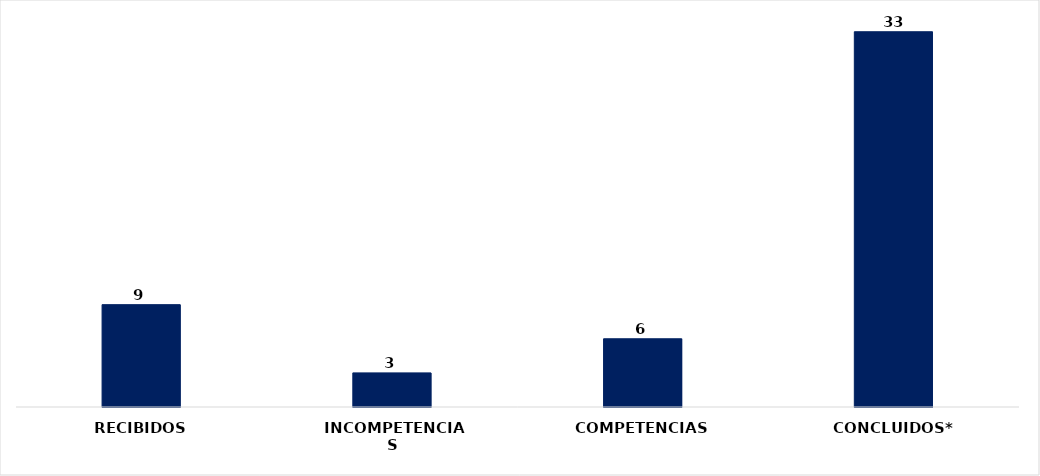
| Category | CANTIDAD |
|---|---|
| RECIBIDOS | 9 |
| INCOMPETENCIAS | 3 |
| COMPETENCIAS | 6 |
| CONCLUIDOS* | 33 |